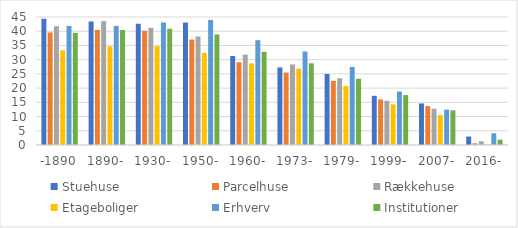
| Category | Stuehuse | Parcelhuse | Rækkehuse | Etageboliger | Erhverv | Institutioner |
|---|---|---|---|---|---|---|
| -1890 | 44.372 | 39.567 | 41.755 | 33.295 | 41.823 | 39.389 |
| 1890- | 43.418 | 40.486 | 43.548 | 34.677 | 41.875 | 40.427 |
| 1930- | 42.627 | 40.162 | 41.176 | 34.756 | 43.065 | 40.849 |
| 1950- | 43.043 | 37.075 | 38.149 | 32.377 | 43.988 | 38.875 |
| 1960- | 31.302 | 29.092 | 31.758 | 28.712 | 36.853 | 32.754 |
| 1973- | 27.283 | 25.488 | 28.313 | 26.87 | 32.892 | 28.717 |
| 1979- | 24.973 | 22.559 | 23.459 | 20.731 | 27.446 | 23.311 |
| 1999- | 17.301 | 16.012 | 15.552 | 14.299 | 18.787 | 17.558 |
| 2007- | 14.61 | 13.686 | 12.755 | 10.521 | 12.421 | 12.181 |
| 2016- | 2.976 | 0.596 | 1.311 | 0.291 | 4.122 | 1.898 |